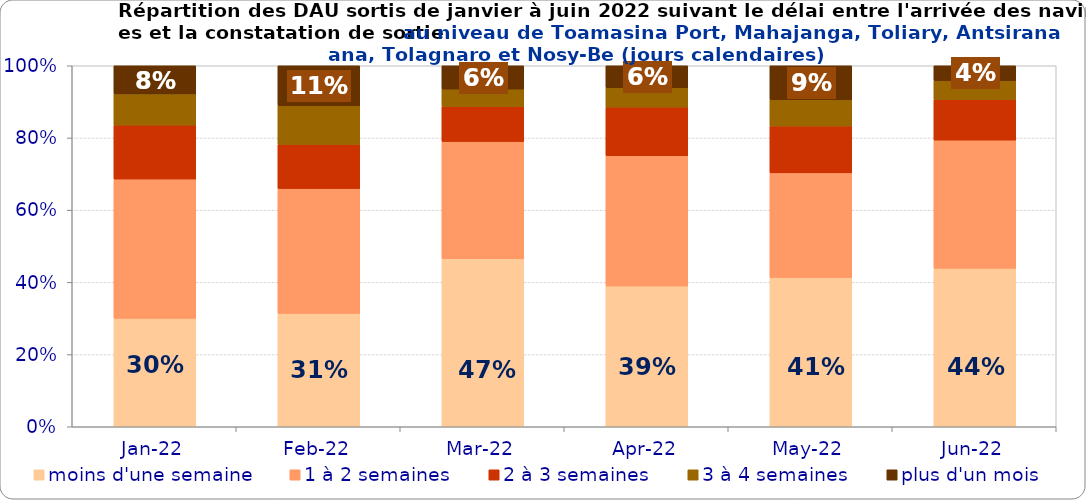
| Category | moins d'une semaine | 1 à 2 semaines | 2 à 3 semaines | 3 à 4 semaines | plus d'un mois |
|---|---|---|---|---|---|
| 2022-01-01 | 0.3 | 0.386 | 0.149 | 0.087 | 0.078 |
| 2022-02-01 | 0.314 | 0.346 | 0.122 | 0.107 | 0.111 |
| 2022-03-01 | 0.465 | 0.325 | 0.097 | 0.048 | 0.065 |
| 2022-04-01 | 0.39 | 0.361 | 0.135 | 0.054 | 0.061 |
| 2022-05-01 | 0.413 | 0.29 | 0.13 | 0.073 | 0.094 |
| 2022-06-01 | 0.439 | 0.355 | 0.112 | 0.053 | 0.041 |